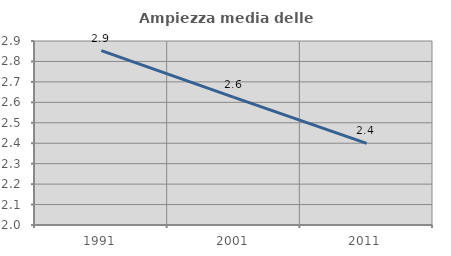
| Category | Ampiezza media delle famiglie |
|---|---|
| 1991.0 | 2.853 |
| 2001.0 | 2.624 |
| 2011.0 | 2.399 |